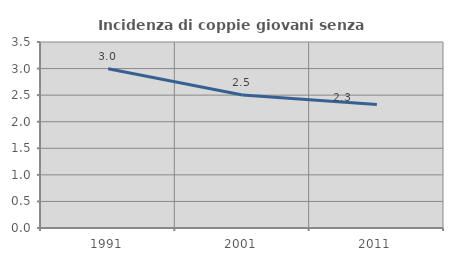
| Category | Incidenza di coppie giovani senza figli |
|---|---|
| 1991.0 | 2.997 |
| 2001.0 | 2.502 |
| 2011.0 | 2.326 |